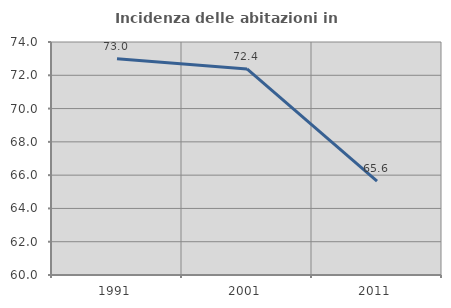
| Category | Incidenza delle abitazioni in proprietà  |
|---|---|
| 1991.0 | 72.992 |
| 2001.0 | 72.382 |
| 2011.0 | 65.637 |